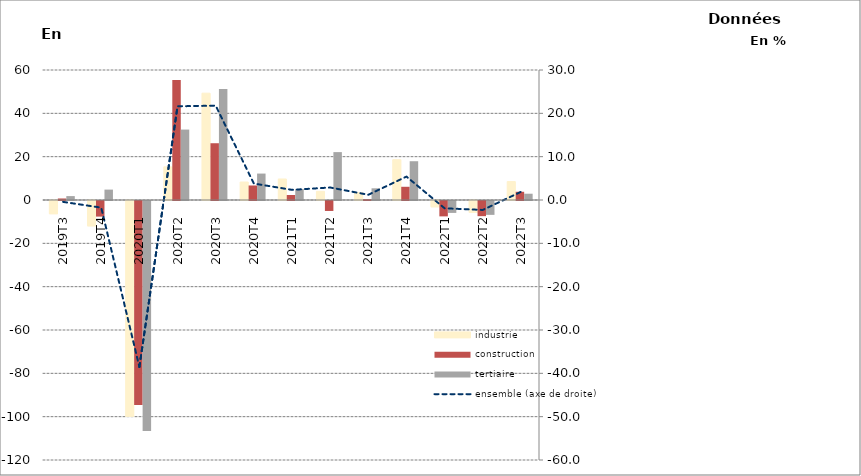
| Category | industrie | construction | tertiaire |
|---|---|---|---|
| 2019T3 | -6.1 | 0.7 | 1.8 |
| 2019T4 | -11.7 | -7.2 | 4.8 |
| 2020T1 | -99.6 | -94.1 | -106.2 |
| 2020T2 | 15.3 | 55.4 | 32.5 |
| 2020T3 | 49.3 | 26.2 | 51.2 |
| 2020T4 | 8.3 | 6.7 | 12.2 |
| 2021T1 | 9.7 | 2.3 | 5.1 |
| 2021T2 | 4 | -4.6 | 22.1 |
| 2021T3 | 3.4 | 0.4 | 5.4 |
| 2021T4 | 18.6 | 6.1 | 17.9 |
| 2022T1 | -2.9 | -7.1 | -5.5 |
| 2022T2 | -5.5 | -7 | -6.4 |
| 2022T3 | 8.5 | 3.8 | 2.9 |